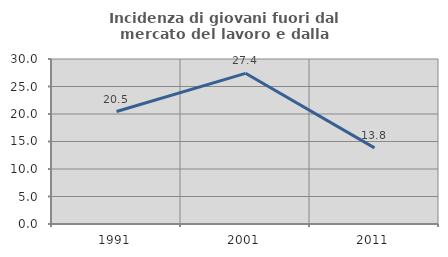
| Category | Incidenza di giovani fuori dal mercato del lavoro e dalla formazione  |
|---|---|
| 1991.0 | 20.455 |
| 2001.0 | 27.397 |
| 2011.0 | 13.846 |